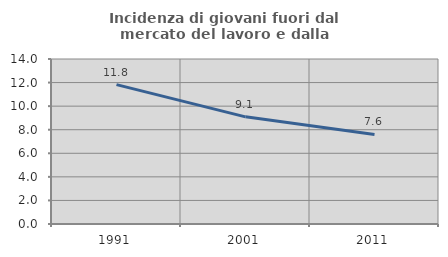
| Category | Incidenza di giovani fuori dal mercato del lavoro e dalla formazione  |
|---|---|
| 1991.0 | 11.822 |
| 2001.0 | 9.091 |
| 2011.0 | 7.595 |